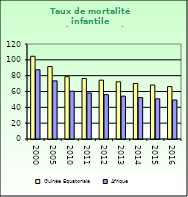
| Category | Guinée Equatoriale | Afrique                        |
|---|---|---|
| 2000.0 | 104.5 | 87.462 |
| 2005.0 | 91.5 | 73.418 |
| 2010.0 | 78.7 | 60.345 |
| 2011.0 | 76.4 | 58.107 |
| 2012.0 | 74.3 | 56.032 |
| 2013.0 | 72.2 | 54.131 |
| 2014.0 | 70.1 | 52.336 |
| 2015.0 | 68.2 | 50.754 |
| 2016.0 | 66.2 | 49.283 |